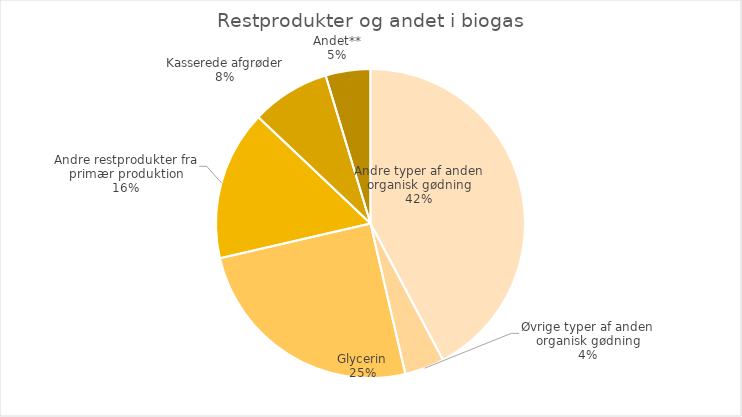
| Category | Series 0 |
|---|---|
| Andre typer af anden organisk gødning | 268474.1 |
| Øvrige typer af anden organisk gødning | 26351.64 |
| Glycerin | 159099.22 |
| Andre restprodukter fra primær produktion | 99631.94 |
| Kasserede afgrøder | 52434.54 |
| Andet** | 29785.34 |